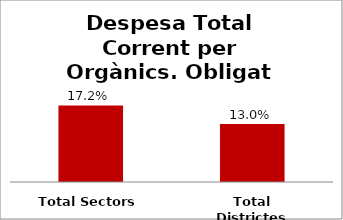
| Category | Series 0 |
|---|---|
| Total Sectors | 0.172 |
| Total Districtes | 0.13 |